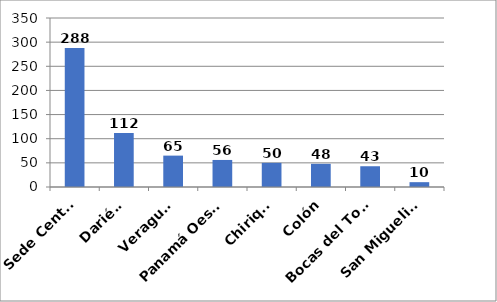
| Category | Series 0 |
|---|---|
| Sede Central | 288 |
| Darién  | 112 |
| Veraguas  | 65 |
| Panamá Oeste  | 56 |
| Chiriquí | 50 |
| Colón | 48 |
| Bocas del Toro  | 43 |
| San Miguelito  | 10 |